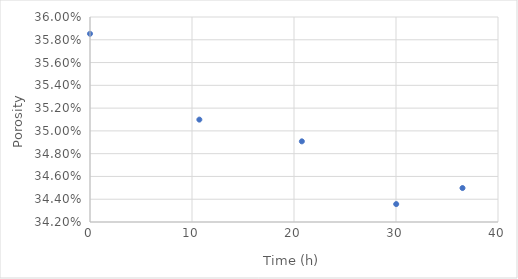
| Category | Series 0 |
|---|---|
| 0.0 | 0.359 |
| 10.72 | 0.351 |
| 20.77 | 0.349 |
| 30.02 | 0.344 |
| 36.52 | 0.345 |